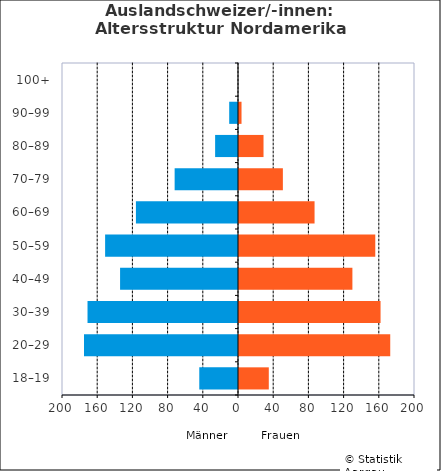
| Category | Männer | Frauen |
|---|---|---|
| 18–19 | -44 | 35 |
| 20–29 | -175 | 173 |
| 30–39 | -171 | 162 |
| 40–49 | -134 | 130 |
| 50–59 | -151 | 156 |
| 60–69 | -116 | 87 |
| 70–79 | -72 | 51 |
| 80–89 | -26 | 29 |
| 90–99 | -10 | 4 |
| 100+ | 0 | 0 |